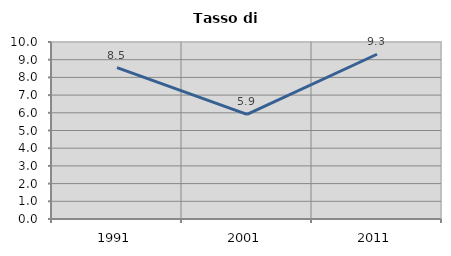
| Category | Tasso di disoccupazione   |
|---|---|
| 1991.0 | 8.548 |
| 2001.0 | 5.912 |
| 2011.0 | 9.308 |